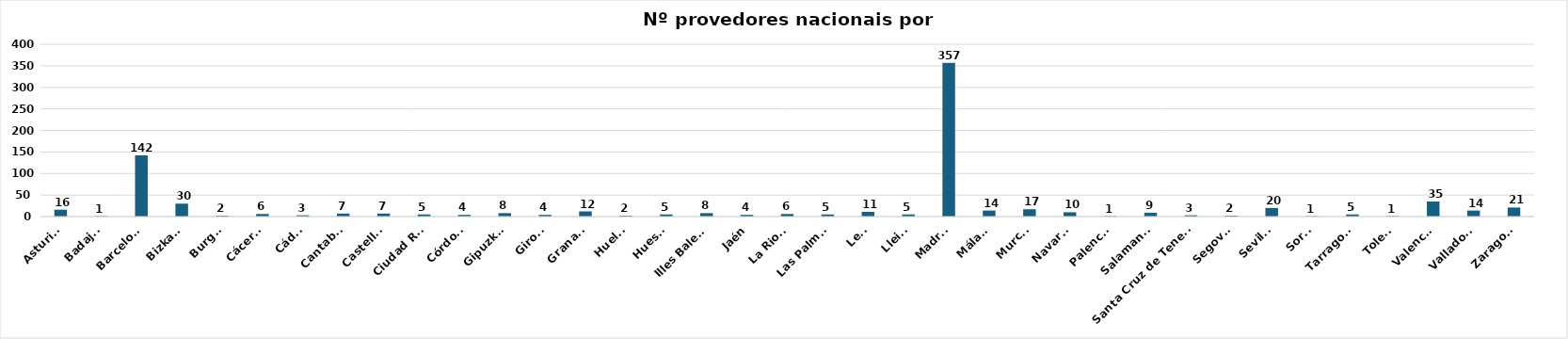
| Category | Series 0 |
|---|---|
| Asturias | 16 |
| Badajoz | 1 |
| Barcelona | 142 |
| Bizkaia | 30 |
| Burgos | 2 |
| Cáceres | 6 |
| Cádiz | 3 |
| Cantabria | 7 |
| Castellón | 7 |
| Ciudad Real | 5 |
| Córdoba | 4 |
| Gipuzkoa | 8 |
| Girona | 4 |
| Granada | 12 |
| Huelva | 2 |
| Huesca | 5 |
| Illes Balears | 8 |
| Jaén | 4 |
| La Rioja | 6 |
| Las Palmas | 5 |
| León | 11 |
| Lleida | 5 |
| Madrid | 357 |
| Málaga | 14 |
| Murcia | 17 |
| Navarra | 10 |
| Palencia | 1 |
| Salamanca | 9 |
| Santa Cruz de Tenerife | 3 |
| Segovia | 2 |
| Sevilla | 20 |
| Soria | 1 |
| Tarragona | 5 |
| Toledo | 1 |
| Valencia | 35 |
| Valladolid | 14 |
| Zaragoza | 21 |